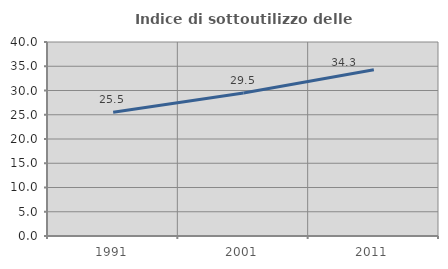
| Category | Indice di sottoutilizzo delle abitazioni  |
|---|---|
| 1991.0 | 25.535 |
| 2001.0 | 29.464 |
| 2011.0 | 34.29 |